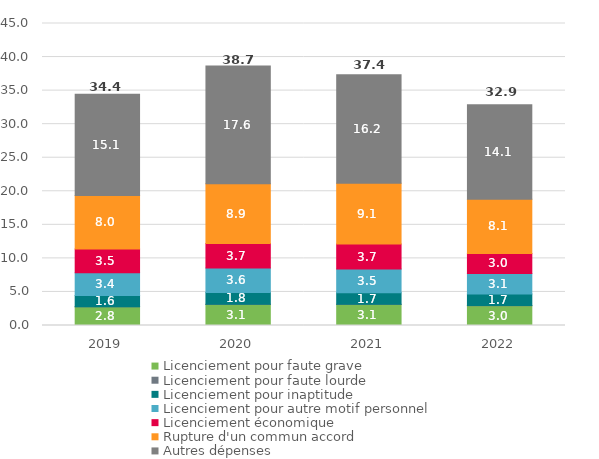
| Category | Ensemble |
|---|---|
| 2019.0 | 34444.53 |
| 2020.0 | 38681.169 |
| 2021.0 | 37357.165 |
| 2022.0 | 32905.926 |